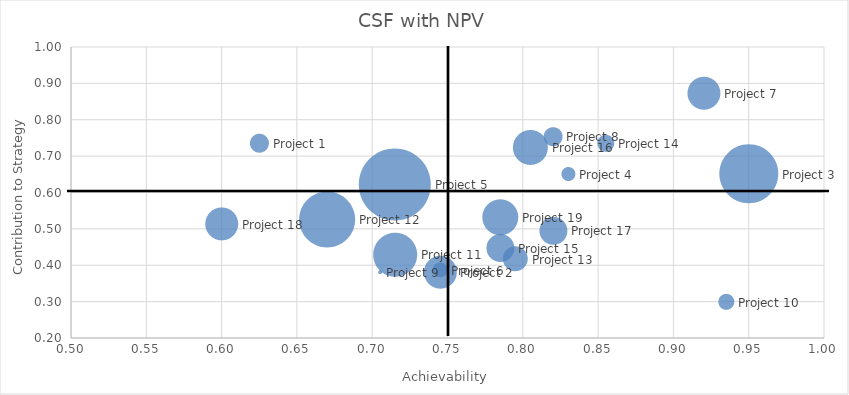
| Category | CSF with NPV |
|---|---|
| 0.625 | 0.736 |
| 0.745 | 0.382 |
| 0.95 | 0.652 |
| 0.83 | 0.652 |
| 0.715 | 0.622 |
| 0.745 | 0.388 |
| 0.92 | 0.874 |
| 0.82 | 0.754 |
| 0.7050000000000001 | 0.382 |
| 0.935 | 0.3 |
| 0.7150000000000001 | 0.43 |
| 0.6699999999999999 | 0.526 |
| 0.7949999999999999 | 0.418 |
| 0.855 | 0.736 |
| 0.7849999999999999 | 0.448 |
| 0.8049999999999999 | 0.724 |
| 0.8200000000000001 | 0.496 |
| 0.6 | 0.514 |
| 0.7849999999999999 | 0.532 |